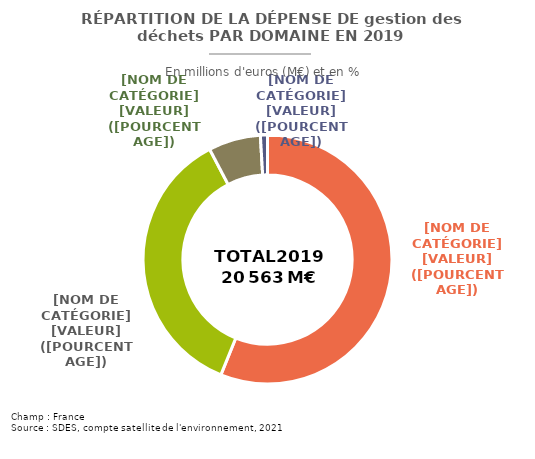
| Category | Series 0 |
|---|---|
| Déchets municipaux et assimilés (DMA) | 11538.508 |
| Déchets industriels | 7442.956 |
| Nettoyage des rues | 1393.971 |
| Achat de sacs poubelles | 187.399 |